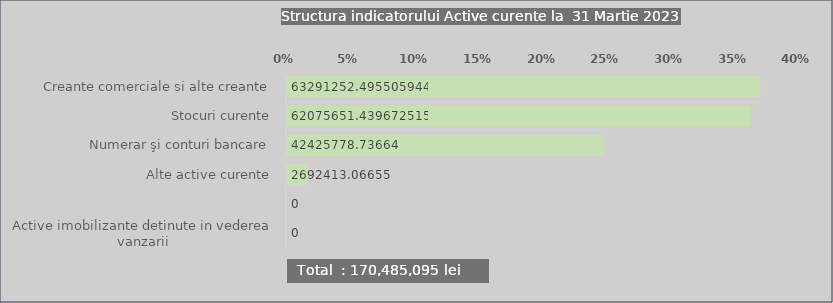
| Category | Series 0 |
|---|---|
| Creante comerciale si alte creante | 0.371 |
| Stocuri curente | 0.364 |
| Numerar şi conturi bancare | 0.249 |
| Alte active curente | 0.016 |
|  | 0 |
| Active imobilizante detinute in vederea vanzarii | 0 |